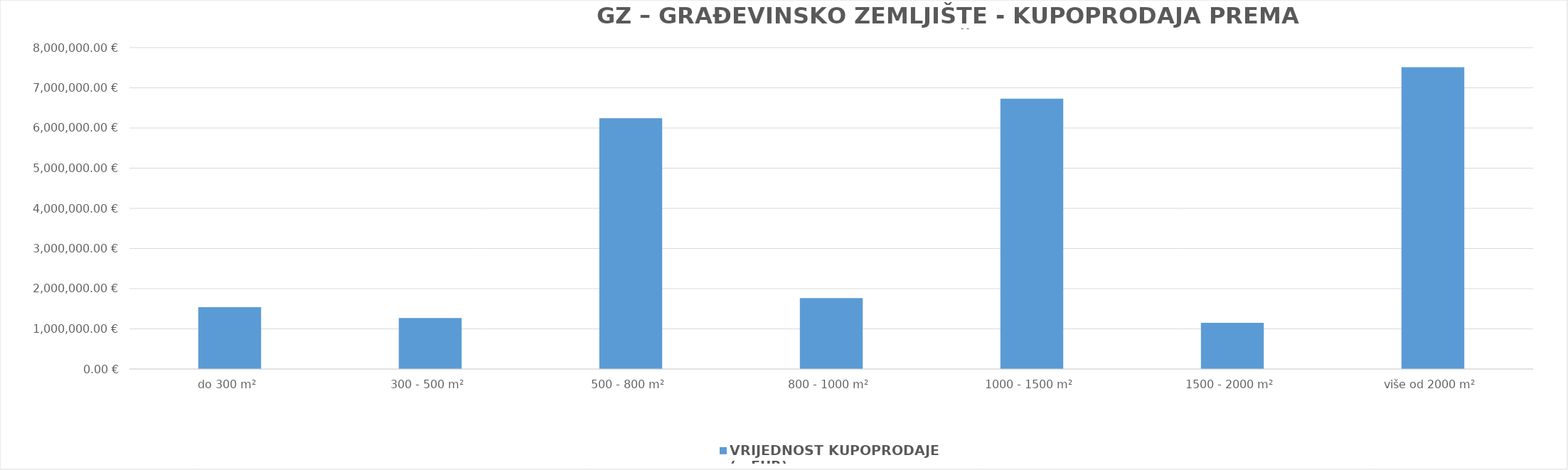
| Category | VRIJEDNOST KUPOPRODAJE (u EUR) |
|---|---|
| do 300 m² | 1541101.969 |
| 300 - 500 m² | 1269995.932 |
| 500 - 800 m² | 6245570.05 |
| 800 - 1000 m² | 1763361.209 |
| 1000 - 1500 m² | 6730943.496 |
| 1500 - 2000 m² | 1148425.62 |
| više od 2000 m² | 7513869.119 |